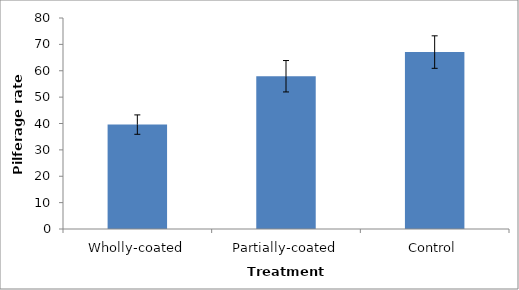
| Category | Series 0 |
|---|---|
| Wholly-coated | 39.583 |
| Partially-coated | 57.917 |
| Control | 67.083 |